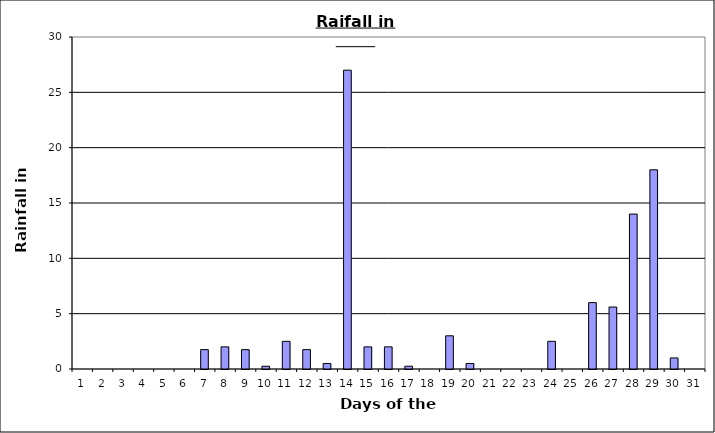
| Category | Rain |
|---|---|
| 0 | 0 |
| 1 | 0 |
| 2 | 0 |
| 3 | 0 |
| 4 | 0 |
| 5 | 0 |
| 6 | 1.75 |
| 7 | 2 |
| 8 | 1.75 |
| 9 | 0.25 |
| 10 | 2.5 |
| 11 | 1.75 |
| 12 | 0.5 |
| 13 | 27 |
| 14 | 2 |
| 15 | 2 |
| 16 | 0.25 |
| 17 | 0 |
| 18 | 3 |
| 19 | 0.5 |
| 20 | 0 |
| 21 | 0 |
| 22 | 0 |
| 23 | 2.5 |
| 24 | 0 |
| 25 | 6 |
| 26 | 5.6 |
| 27 | 14 |
| 28 | 18 |
| 29 | 1 |
| 30 | 0 |